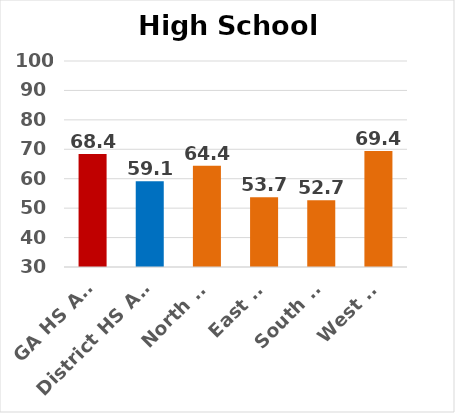
| Category | 2014 CCRPI |
|---|---|
| GA HS Avg | 68.4 |
| District HS Avg | 59.1 |
| North HS | 64.4 |
| East HS | 53.7 |
| South HS | 52.7 |
| West HS | 69.4 |